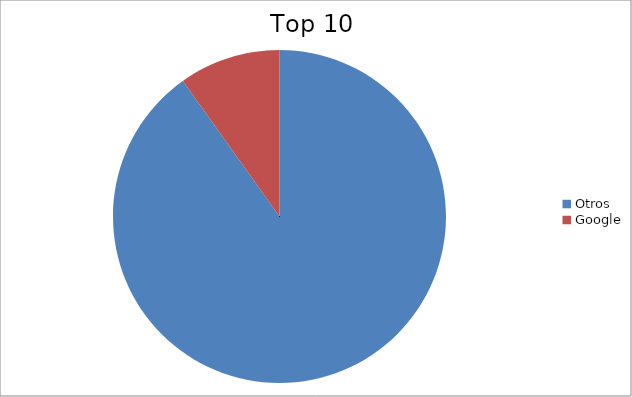
| Category | Series 0 |
|---|---|
| Otros | 90.14 |
| Google | 9.86 |